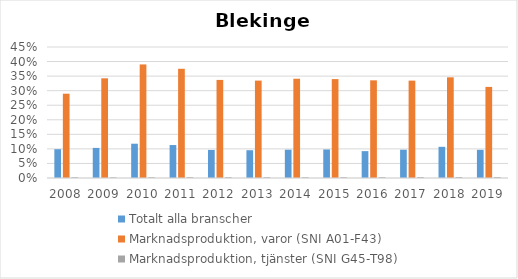
| Category | Totalt alla branscher | Marknadsproduktion, varor (SNI A01-F43) | Marknadsproduktion, tjänster (SNI G45-T98) |
|---|---|---|---|
| 2008 | 0.099 | 0.29 | 0.003 |
| 2009 | 0.103 | 0.342 | 0.002 |
| 2010 | 0.118 | 0.39 | 0.003 |
| 2011 | 0.113 | 0.375 | 0.003 |
| 2012 | 0.096 | 0.337 | 0.003 |
| 2013 | 0.095 | 0.335 | 0.003 |
| 2014 | 0.097 | 0.341 | 0.003 |
| 2015 | 0.098 | 0.34 | 0.003 |
| 2016 | 0.092 | 0.335 | 0.003 |
| 2017 | 0.097 | 0.334 | 0.004 |
| 2018 | 0.107 | 0.346 | 0.003 |
| 2019 | 0.097 | 0.313 | 0.003 |